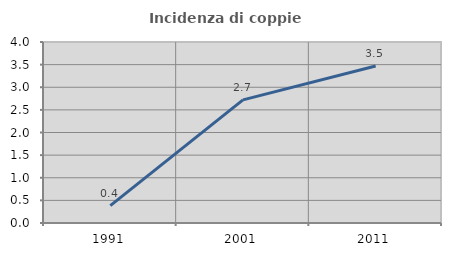
| Category | Incidenza di coppie miste |
|---|---|
| 1991.0 | 0.383 |
| 2001.0 | 2.722 |
| 2011.0 | 3.469 |